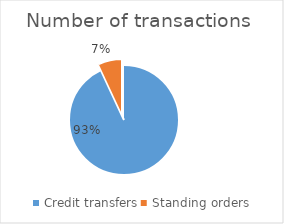
| Category | Number of transactions  |
|---|---|
| Credit transfers | 328830660 |
| Standing orders | 24524071 |